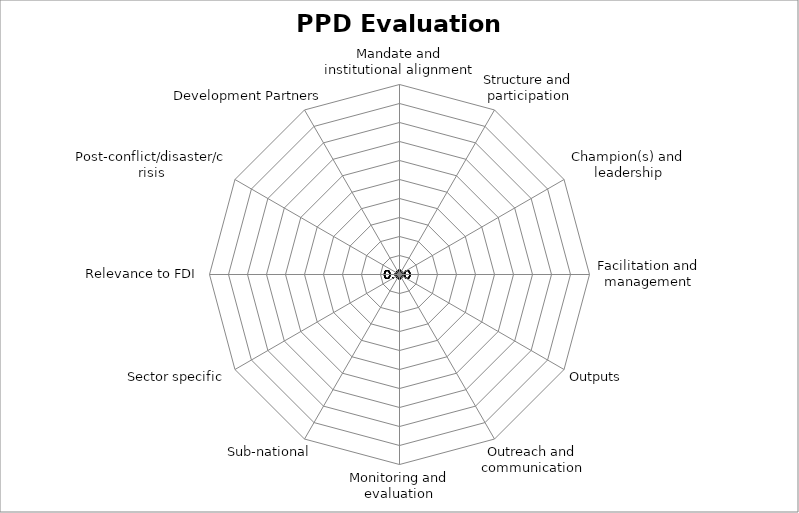
| Category | Series 0 |
|---|---|
| Mandate and institutional alignment | 0 |
| Structure and participation | 0 |
| Champion(s) and leadership | 0 |
| Facilitation and management | 0 |
| Outputs | 0 |
| Outreach and communication | 0 |
| Monitoring and evaluation | 0 |
| Sub-national | 0 |
| Sector specific | 0 |
| Relevance to FDI | 0 |
| Post-conflict/disaster/crisis | 0 |
| Development Partners | 0 |